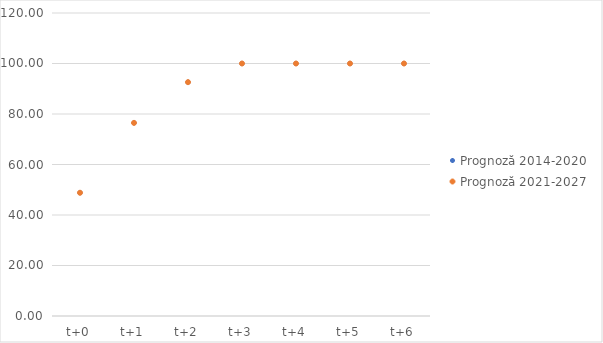
| Category | Prognoză 2014-2020 | Prognoză 2021-2027 |
|---|---|---|
| t+0 | 48.812 | 48.812 |
| t+1 | 76.483 | 76.483 |
| t+2 | 92.613 | 92.613 |
| t+3 | 100 | 100 |
| t+4 | 100 | 100 |
| t+5 | 100 | 100 |
| t+6 | 100 | 100 |